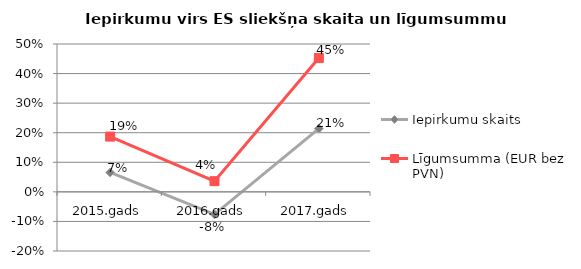
| Category | Iepirkumu skaits | Līgumsumma (EUR bez PVN) |
|---|---|---|
| 2015.gads | 0.066 | 0.187 |
| 2016.gads | -0.076 | 0.036 |
| 2017.gads | 0.214 | 0.452 |